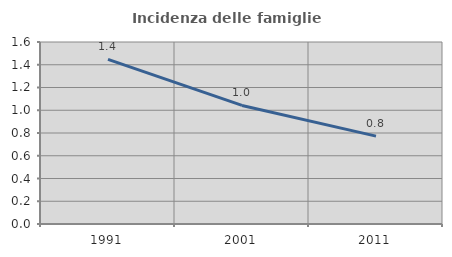
| Category | Incidenza delle famiglie numerose |
|---|---|
| 1991.0 | 1.447 |
| 2001.0 | 1.043 |
| 2011.0 | 0.772 |